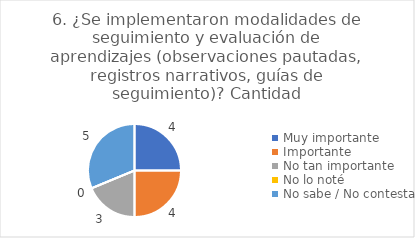
| Category | 6. ¿Se implementaron modalidades de seguimiento y evaluación de aprendizajes (observaciones pautadas, registros narrativos, guías de seguimiento)? |
|---|---|
| Muy importante  | 0.25 |
| Importante  | 0.25 |
| No tan importante  | 0.188 |
| No lo noté  | 0 |
| No sabe / No contesta | 0.312 |